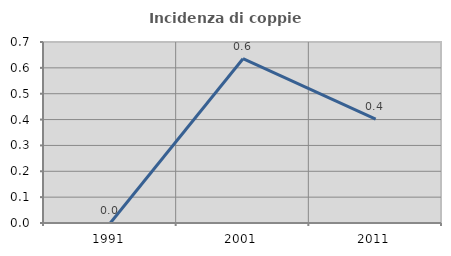
| Category | Incidenza di coppie miste |
|---|---|
| 1991.0 | 0 |
| 2001.0 | 0.635 |
| 2011.0 | 0.402 |